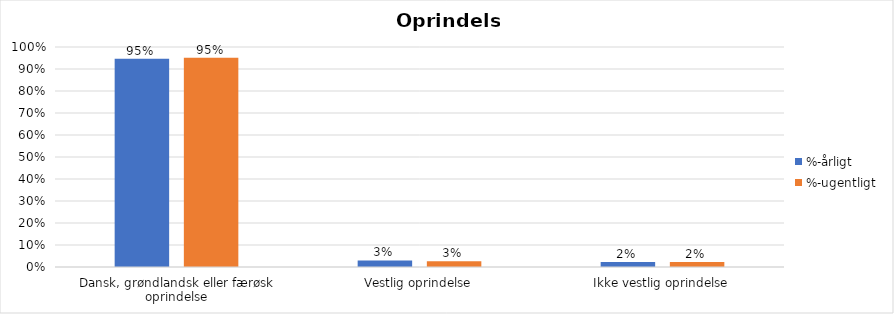
| Category | %-årligt | %-ugentligt |
|---|---|---|
| Dansk, grøndlandsk eller færøsk oprindelse | 0.947 | 0.951 |
| Vestlig oprindelse | 0.03 | 0.026 |
| Ikke vestlig oprindelse | 0.023 | 0.022 |